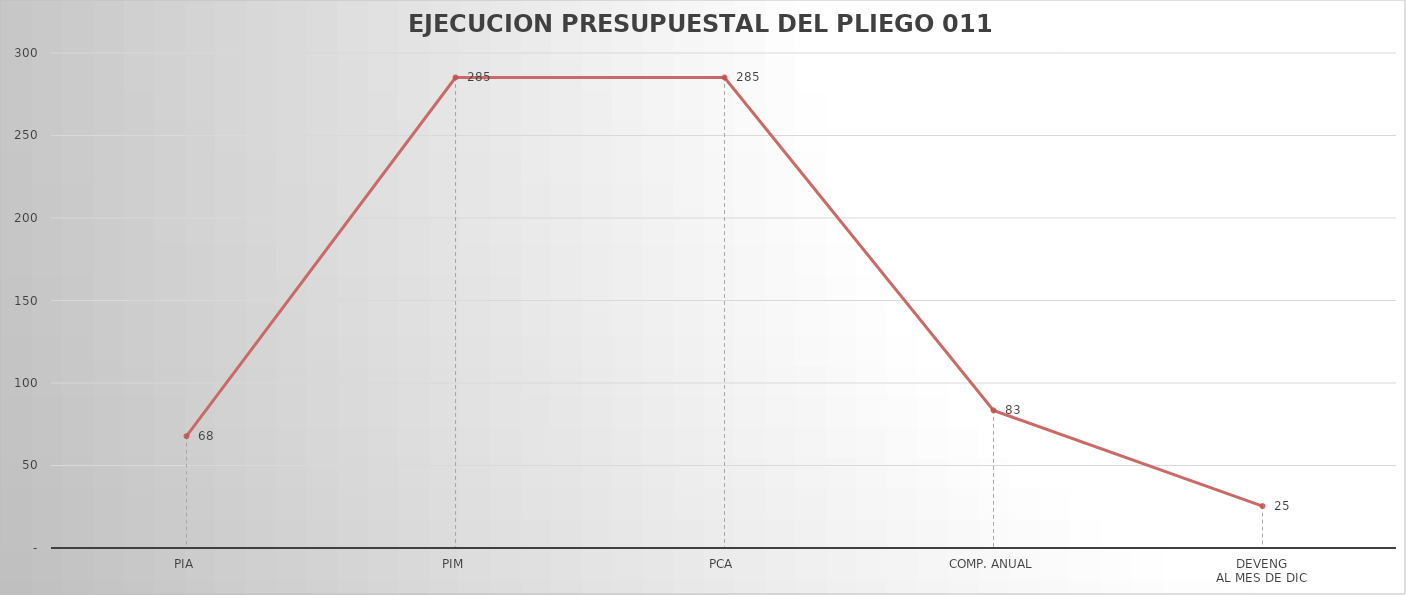
| Category | Series 0 |
|---|---|
| PIA | 67.768 |
| PIM | 285.161 |
| PCA | 285.161 |
| COMP. ANUAL | 83.411 |
| DEVENG
AL MES DE DIC | 25.409 |